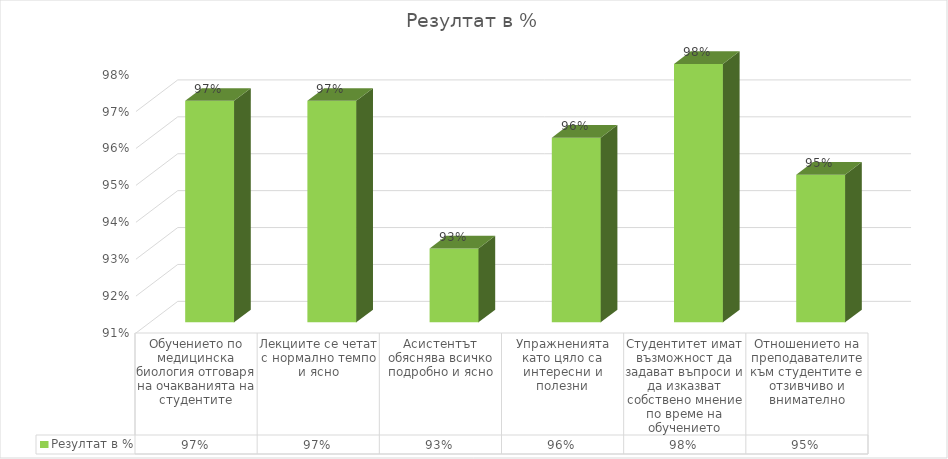
| Category | Резултат в % |
|---|---|
| Обучението по медицинска биология отговаря на очакванията на студентите | 0.97 |
| Лекциите се четат с нормално темпо и ясно | 0.97 |
| Асистентът обяснява всичко подробно и ясно | 0.93 |
| Упражненията като цяло са интересни и полезни | 0.96 |
| Студентитет имат възможност да задават въпроси и да изказват собствено мнение по време на обучението | 0.98 |
| Отношението на преподавателите към студентите е отзивчиво и внимателно | 0.95 |